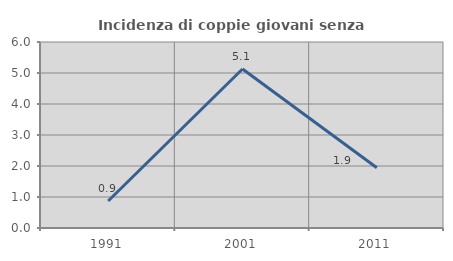
| Category | Incidenza di coppie giovani senza figli |
|---|---|
| 1991.0 | 0.87 |
| 2001.0 | 5.128 |
| 2011.0 | 1.942 |